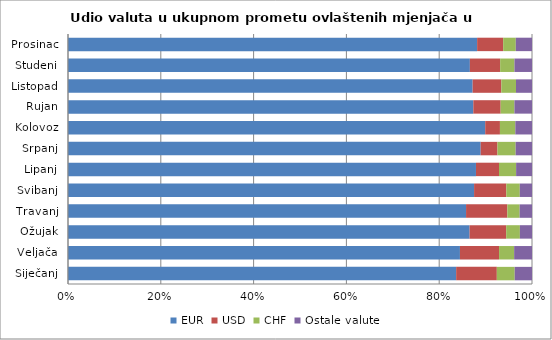
| Category | EUR | USD | CHF | Ostale valute |
|---|---|---|---|---|
| Siječanj | 83.653 | 8.768 | 3.852 | 3.728 |
| Veljača | 84.472 | 8.428 | 3.252 | 3.848 |
| Ožujak | 86.551 | 7.887 | 2.952 | 2.61 |
| Travanj | 85.788 | 8.902 | 2.65 | 2.661 |
| Svibanj | 87.518 | 6.947 | 2.904 | 2.631 |
| Lipanj | 87.925 | 4.958 | 3.693 | 3.424 |
| Srpanj | 88.941 | 3.618 | 3.919 | 3.522 |
| Kolovoz | 89.917 | 3.173 | 3.316 | 3.594 |
| Rujan | 87.349 | 5.896 | 2.964 | 3.79 |
| Listopad | 87.206 | 6.185 | 3.165 | 3.444 |
| Studeni | 86.613 | 6.521 | 3.083 | 3.783 |
| Prosinac | 88.171 | 5.616 | 2.723 | 3.49 |